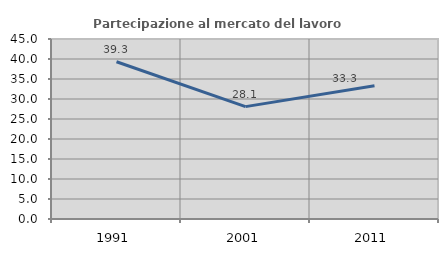
| Category | Partecipazione al mercato del lavoro  femminile |
|---|---|
| 1991.0 | 39.315 |
| 2001.0 | 28.095 |
| 2011.0 | 33.333 |